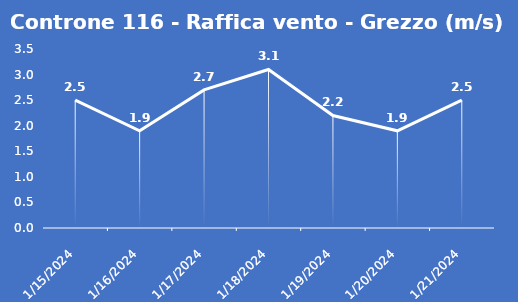
| Category | Controne 116 - Raffica vento - Grezzo (m/s) |
|---|---|
| 1/15/24 | 2.5 |
| 1/16/24 | 1.9 |
| 1/17/24 | 2.7 |
| 1/18/24 | 3.1 |
| 1/19/24 | 2.2 |
| 1/20/24 | 1.9 |
| 1/21/24 | 2.5 |